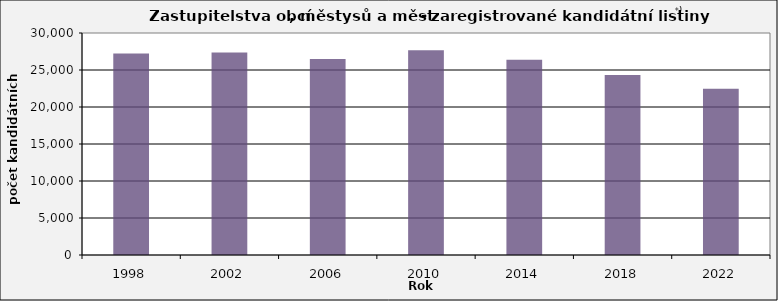
| Category | Počet kandidátních listin |
|---|---|
| 1998.0 | 27218 |
| 2002.0 | 27353 |
| 2006.0 | 26496 |
| 2010.0 | 27683 |
| 2014.0 | 26370 |
| 2018.0 | 24323 |
| 2022.0 | 22467 |